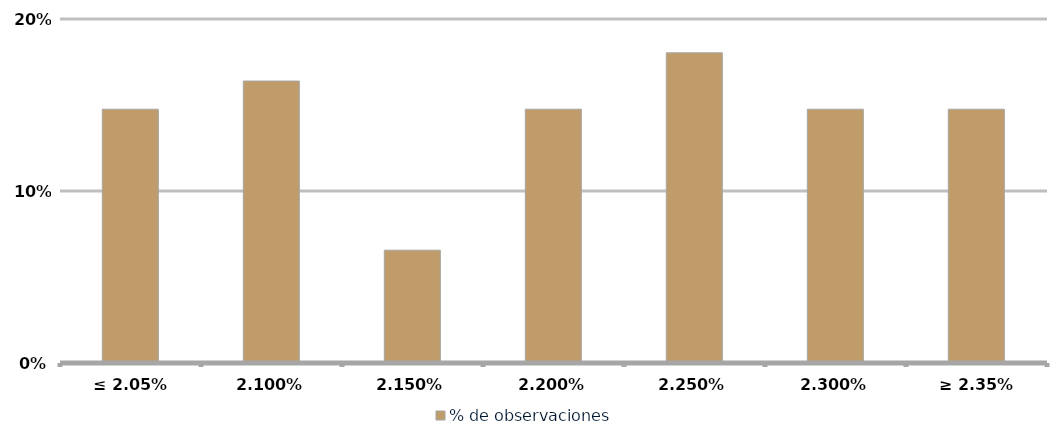
| Category | % de observaciones  |
|---|---|
| ≤ 2.05% | 0.148 |
| 2.10% | 0.164 |
| 2.15% | 0.066 |
| 2.20% | 0.148 |
| 2.25% | 0.18 |
| 2.30% | 0.148 |
| ≥ 2.35% | 0.148 |